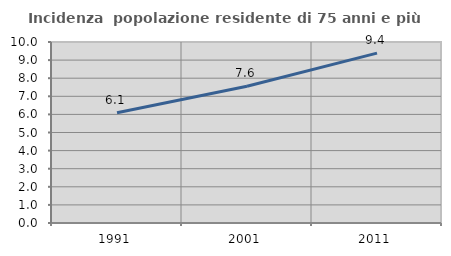
| Category | Incidenza  popolazione residente di 75 anni e più |
|---|---|
| 1991.0 | 6.096 |
| 2001.0 | 7.558 |
| 2011.0 | 9.388 |